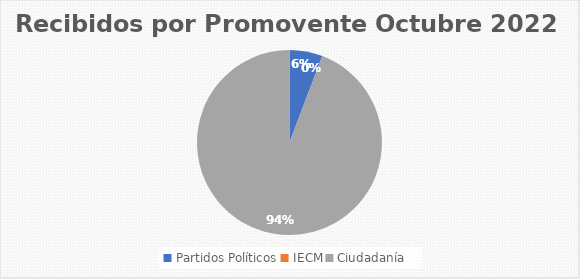
| Category | Recibidos por Promovente Octubre |
|---|---|
| Partidos Políticos | 3 |
| IECM | 0 |
| Ciudadanía  | 49 |